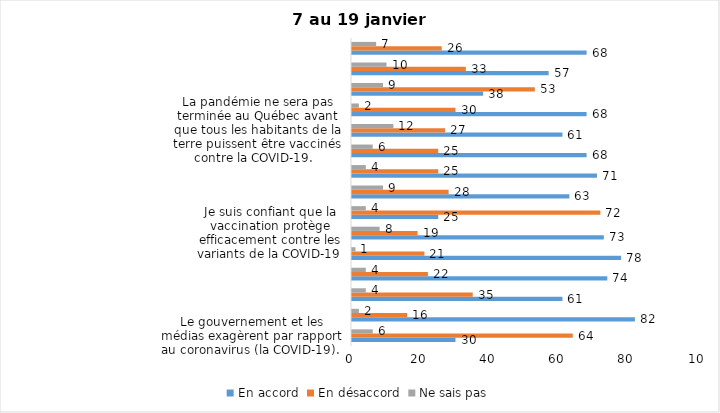
| Category | En accord | En désaccord | Ne sais pas |
|---|---|---|---|
| Le gouvernement et les médias exagèrent par rapport au coronavirus (la COVID-19). | 30 | 64 | 6 |
| J’ai peur que le système de santé soit débordé par les cas de COVID-19. | 82 | 16 | 2 |
| Je suis favorable au maintien du couvre-feu pour les prochaines semaines. | 61 | 35 | 4 |
| Je suis inquiet/inquiète que le nombre de cas augmente en raison des nouveaux variants du virus de la COVID-19. | 74 | 22 | 4 |
| Je suis favorable au passeport vaccinal qui permettrait l'accès à certains lieux ou activités aux personnes vaccinées. | 78 | 21 | 1 |
| Je suis confiant que la vaccination protège efficacement contre les variants de la COVID-19 | 73 | 19 | 8 |
| Je suis favorable à ce que le port du masque ne soit plus obligatoire au Québec. | 25 | 72 | 4 |
| J'ai peur que la reprise des cours en présentiel dans les écoles primaires et secondaires génère une augmentation des cas de COVID-19 | 63 | 28 | 9 |
| Je crois que le passeport vaccinal devrait être requis pour davantage de services et commerces (ex. : spas, centre d’achats, centre de soins personnels. | 71 | 25 | 4 |
| Les personnes non adéquatement vaccinées contre la COVID-19 sont responsables des nouveaux cas et hospitalisations et contribuent à la prolongation de la pandémie au Québec. | 68 | 25 | 6 |
| La pandémie ne sera pas terminée au Québec avant que tous les habitants de la terre puissent être vaccinés contre la COVID-19.   | 61 | 27 | 12 |
| Je suis inconfortable d’être en contact avec une personne non vaccinée contre la COVID-19 | 68 | 30 | 2 |
| Je n'ai pas peur du variant Omicron, car il semble moins dangereux pour la santé. | 38 | 53 | 9 |
| La vaccination obligatoire contre la COVID-19 mettrait fin à la pandémie. | 57 | 33 | 10 |
| Je suis favorable à ce que les personnes non vaccinées paient une taxe supplémentaire (contribution santé). | 68 | 26 | 7 |